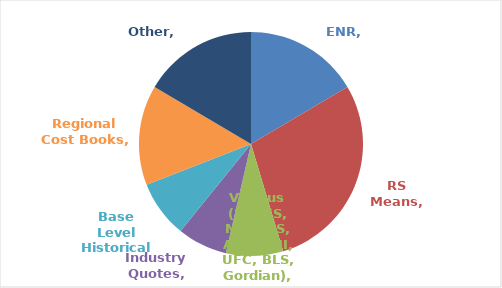
| Category | Series 0 |
|---|---|
| ENR | 0.16 |
| RS Means | 0.28 |
| Various (PACES, MCASES, AEC, BNI, UFC, BLS, Gordian) | 0.08 |
| Industry Quotes | 0.07 |
| Base Level Historical Costs | 0.08 |
| Regional Cost Books | 0.14 |
| Other | 0.16 |